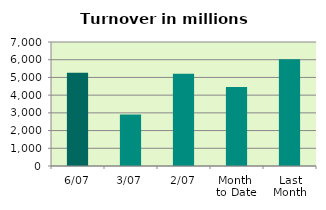
| Category | Series 0 |
|---|---|
| 6/07 | 5259.152 |
| 3/07 | 2909.703 |
| 2/07 | 5214.039 |
| Month 
to Date | 4459.536 |
| Last
Month | 6026.772 |